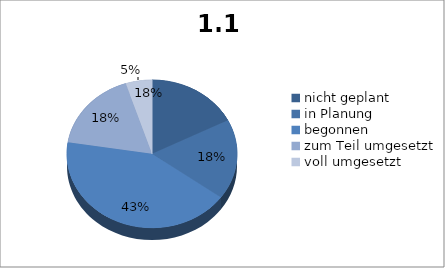
| Category | 1.1  Aufbauorganisation  |
|---|---|
| nicht geplant | 7 |
| in Planung | 7 |
| begonnen | 17 |
| zum Teil umgesetzt | 7 |
| voll umgesetzt | 2 |